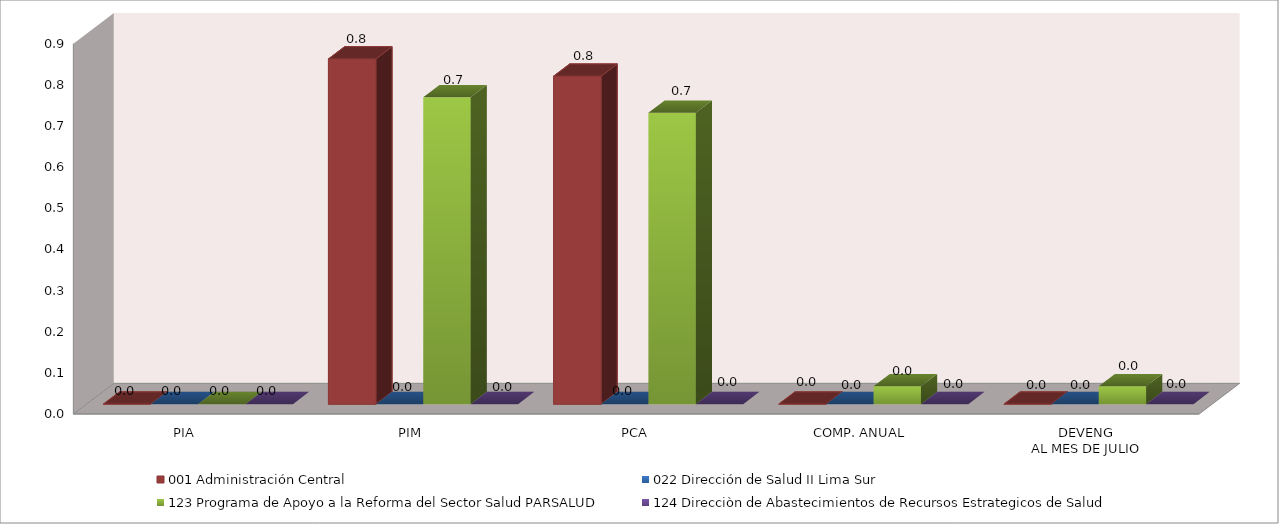
| Category | 001 Administración Central | 022 Dirección de Salud II Lima Sur | 123 Programa de Apoyo a la Reforma del Sector Salud PARSALUD | 124 Direcciòn de Abastecimientos de Recursos Estrategicos de Salud |
|---|---|---|---|---|
| PIA | 0 | 0 | 0 | 0 |
| PIM | 0.839 | 0 | 0.746 | 0 |
| PCA | 0.797 | 0 | 0.708 | 0 |
| COMP. ANUAL | 0 | 0 | 0.043 | 0 |
| DEVENG
AL MES DE JULIO | 0 | 0 | 0.043 | 0 |